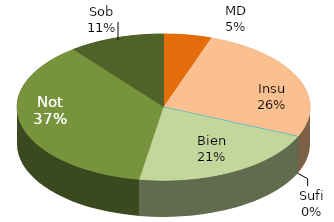
| Category | Series 0 |
|---|---|
| MD | 1 |
| Insu | 5 |
| Sufi | 0 |
| Bien | 4 |
| Not | 7 |
| Sob | 2 |